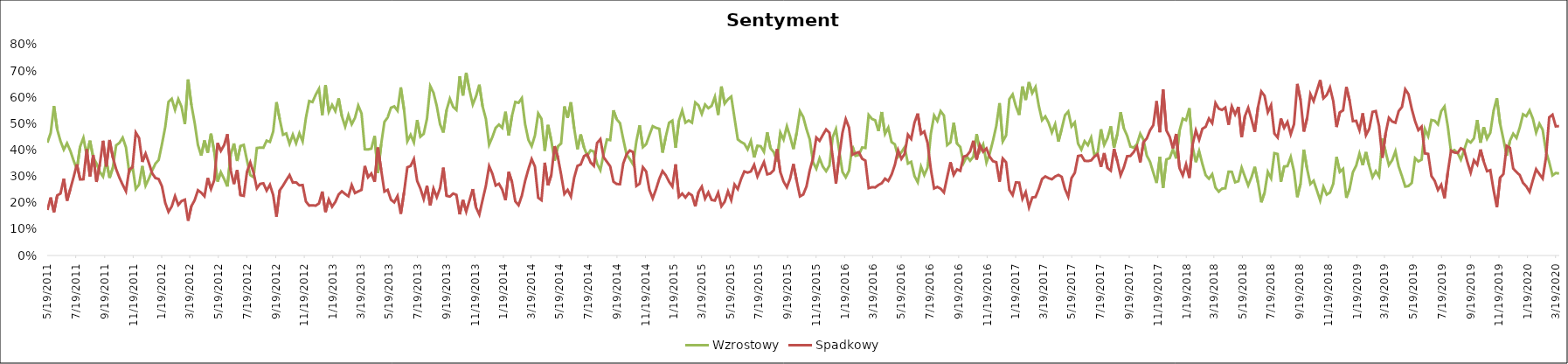
| Category | Wzrostowy | Spadkowy |
|---|---|---|
| 5/19/11 | 0.428 | 0.173 |
| 5/26/11 | 0.465 | 0.22 |
| 6/2/11 | 0.567 | 0.164 |
| 6/9/11 | 0.478 | 0.228 |
| 6/16/11 | 0.434 | 0.235 |
| 6/23/11 | 0.402 | 0.291 |
| 6/30/11 | 0.426 | 0.208 |
| 7/7/11 | 0.397 | 0.252 |
| 7/14/11 | 0.36 | 0.297 |
| 7/21/11 | 0.327 | 0.346 |
| 7/28/11 | 0.413 | 0.288 |
| 8/4/11 | 0.446 | 0.289 |
| 8/11/11 | 0.382 | 0.403 |
| 8/18/11 | 0.436 | 0.3 |
| 8/25/11 | 0.372 | 0.38 |
| 9/1/11 | 0.349 | 0.279 |
| 9/8/11 | 0.317 | 0.345 |
| 9/15/11 | 0.299 | 0.435 |
| 9/22/11 | 0.358 | 0.338 |
| 9/29/11 | 0.295 | 0.438 |
| 10/6/11 | 0.333 | 0.372 |
| 10/13/11 | 0.418 | 0.328 |
| 10/20/11 | 0.427 | 0.295 |
| 10/27/11 | 0.447 | 0.268 |
| 11/3/11 | 0.41 | 0.244 |
| 11/10/11 | 0.315 | 0.327 |
| 11/17/11 | 0.34 | 0.334 |
| 11/24/11 | 0.252 | 0.466 |
| 12/1/11 | 0.269 | 0.446 |
| 12/8/11 | 0.34 | 0.355 |
| 12/15/11 | 0.265 | 0.387 |
| 12/22/11 | 0.292 | 0.351 |
| 12/29/11 | 0.322 | 0.312 |
| 1/5/12 | 0.348 | 0.294 |
| 1/12/12 | 0.363 | 0.29 |
| 1/19/12 | 0.422 | 0.263 |
| 1/26/12 | 0.487 | 0.2 |
| 2/2/12 | 0.583 | 0.166 |
| 2/9/12 | 0.595 | 0.186 |
| 2/16/12 | 0.553 | 0.225 |
| 2/23/12 | 0.593 | 0.192 |
| 3/1/12 | 0.564 | 0.207 |
| 3/8/12 | 0.498 | 0.212 |
| 3/15/12 | 0.668 | 0.132 |
| 3/22/12 | 0.571 | 0.187 |
| 3/29/12 | 0.503 | 0.21 |
| 4/5/12 | 0.419 | 0.248 |
| 4/12/12 | 0.379 | 0.238 |
| 4/19/12 | 0.436 | 0.225 |
| 4/26/12 | 0.39 | 0.294 |
| 5/3/12 | 0.462 | 0.252 |
| 5/10/12 | 0.393 | 0.286 |
| 5/17/12 | 0.28 | 0.427 |
| 5/24/12 | 0.316 | 0.397 |
| 5/31/12 | 0.291 | 0.419 |
| 6/7/12 | 0.262 | 0.46 |
| 6/14/12 | 0.382 | 0.324 |
| 6/21/12 | 0.425 | 0.271 |
| 6/28/12 | 0.359 | 0.324 |
| 7/5/12 | 0.415 | 0.229 |
| 7/12/12 | 0.42 | 0.226 |
| 7/19/12 | 0.36 | 0.318 |
| 7/26/12 | 0.305 | 0.353 |
| 8/2/12 | 0.297 | 0.314 |
| 8/9/12 | 0.408 | 0.255 |
| 8/16/12 | 0.409 | 0.272 |
| 8/23/12 | 0.409 | 0.274 |
| 8/30/12 | 0.436 | 0.246 |
| 9/6/12 | 0.431 | 0.268 |
| 9/13/12 | 0.47 | 0.229 |
| 9/20/12 | 0.582 | 0.147 |
| 9/27/12 | 0.517 | 0.247 |
| 10/4/12 | 0.458 | 0.265 |
| 10/11/12 | 0.463 | 0.286 |
| 10/18/12 | 0.424 | 0.305 |
| 10/25/12 | 0.458 | 0.277 |
| 11/1/12 | 0.426 | 0.278 |
| 11/8/12 | 0.464 | 0.266 |
| 11/15/12 | 0.433 | 0.267 |
| 11/22/12 | 0.522 | 0.205 |
| 11/29/12 | 0.586 | 0.189 |
| 12/6/12 | 0.582 | 0.19 |
| 12/13/12 | 0.61 | 0.189 |
| 12/20/12 | 0.632 | 0.198 |
| 12/27/12 | 0.533 | 0.243 |
| 1/3/13 | 0.647 | 0.165 |
| 1/10/13 | 0.545 | 0.212 |
| 1/17/13 | 0.571 | 0.185 |
| 1/24/13 | 0.548 | 0.203 |
| 1/31/13 | 0.596 | 0.231 |
| 2/7/13 | 0.528 | 0.243 |
| 2/14/13 | 0.489 | 0.233 |
| 2/21/13 | 0.533 | 0.225 |
| 2/28/13 | 0.498 | 0.267 |
| 3/7/13 | 0.522 | 0.237 |
| 3/14/13 | 0.569 | 0.243 |
| 3/21/13 | 0.539 | 0.249 |
| 3/28/13 | 0.403 | 0.34 |
| 4/4/13 | 0.402 | 0.297 |
| 4/11/13 | 0.406 | 0.311 |
| 4/18/13 | 0.453 | 0.28 |
| 4/25/13 | 0.313 | 0.41 |
| 5/2/13 | 0.422 | 0.325 |
| 5/9/13 | 0.507 | 0.242 |
| 5/16/13 | 0.524 | 0.249 |
| 5/23/13 | 0.561 | 0.212 |
| 5/30/13 | 0.566 | 0.202 |
| 6/6/13 | 0.549 | 0.225 |
| 6/13/13 | 0.638 | 0.158 |
| 6/20/13 | 0.553 | 0.24 |
| 6/27/13 | 0.433 | 0.335 |
| 7/4/13 | 0.458 | 0.34 |
| 7/11/13 | 0.429 | 0.366 |
| 7/18/13 | 0.514 | 0.283 |
| 7/25/13 | 0.451 | 0.254 |
| 8/1/13 | 0.462 | 0.214 |
| 8/8/13 | 0.519 | 0.265 |
| 8/15/13 | 0.642 | 0.19 |
| 8/22/13 | 0.618 | 0.253 |
| 8/29/13 | 0.567 | 0.221 |
| 9/5/13 | 0.498 | 0.255 |
| 9/12/13 | 0.467 | 0.333 |
| 9/19/13 | 0.552 | 0.226 |
| 9/26/13 | 0.595 | 0.224 |
| 10/3/13 | 0.564 | 0.235 |
| 10/10/13 | 0.552 | 0.23 |
| 10/17/13 | 0.68 | 0.156 |
| 10/24/13 | 0.607 | 0.211 |
| 10/31/13 | 0.693 | 0.167 |
| 11/7/13 | 0.627 | 0.209 |
| 11/14/13 | 0.573 | 0.252 |
| 11/21/13 | 0.604 | 0.182 |
| 11/28/13 | 0.648 | 0.155 |
| 12/5/13 | 0.566 | 0.211 |
| 12/12/13 | 0.519 | 0.264 |
| 12/19/13 | 0.42 | 0.339 |
| 12/26/13 | 0.45 | 0.31 |
| 1/2/14 | 0.484 | 0.266 |
| 1/9/14 | 0.497 | 0.272 |
| 1/16/14 | 0.484 | 0.25 |
| 1/23/14 | 0.545 | 0.21 |
| 1/30/14 | 0.455 | 0.317 |
| 2/6/14 | 0.531 | 0.278 |
| 2/13/14 | 0.582 | 0.205 |
| 2/20/14 | 0.579 | 0.191 |
| 2/27/14 | 0.597 | 0.227 |
| 3/6/14 | 0.498 | 0.283 |
| 3/13/14 | 0.439 | 0.327 |
| 3/20/14 | 0.415 | 0.366 |
| 3/27/14 | 0.455 | 0.337 |
| 4/3/14 | 0.539 | 0.219 |
| 4/10/14 | 0.519 | 0.21 |
| 4/17/14 | 0.397 | 0.352 |
| 4/24/14 | 0.495 | 0.266 |
| 5/1/14 | 0.437 | 0.306 |
| 5/8/14 | 0.359 | 0.415 |
| 5/15/14 | 0.414 | 0.374 |
| 5/22/14 | 0.425 | 0.307 |
| 5/29/14 | 0.566 | 0.234 |
| 6/5/14 | 0.522 | 0.249 |
| 6/12/14 | 0.581 | 0.224 |
| 6/19/14 | 0.482 | 0.295 |
| 6/26/14 | 0.403 | 0.34 |
| 7/3/14 | 0.459 | 0.345 |
| 7/10/14 | 0.41 | 0.377 |
| 7/17/14 | 0.379 | 0.383 |
| 7/24/14 | 0.399 | 0.353 |
| 7/31/14 | 0.394 | 0.34 |
| 8/7/14 | 0.348 | 0.427 |
| 8/14/14 | 0.324 | 0.441 |
| 8/21/14 | 0.386 | 0.373 |
| 8/28/14 | 0.44 | 0.356 |
| 9/4/14 | 0.438 | 0.338 |
| 9/11/14 | 0.551 | 0.28 |
| 9/18/14 | 0.516 | 0.271 |
| 9/25/14 | 0.502 | 0.271 |
| 10/2/14 | 0.441 | 0.349 |
| 10/9/14 | 0.383 | 0.383 |
| 10/16/14 | 0.366 | 0.398 |
| 10/23/14 | 0.345 | 0.392 |
| 10/30/14 | 0.433 | 0.264 |
| 11/6/14 | 0.494 | 0.272 |
| 11/13/14 | 0.411 | 0.335 |
| 11/20/14 | 0.422 | 0.319 |
| 11/27/14 | 0.457 | 0.248 |
| 12/4/14 | 0.49 | 0.217 |
| 12/11/14 | 0.484 | 0.251 |
| 12/18/14 | 0.481 | 0.29 |
| 12/25/14 | 0.39 | 0.32 |
| 1/1/15 | 0.451 | 0.304 |
| 1/8/15 | 0.503 | 0.28 |
| 1/15/15 | 0.512 | 0.262 |
| 1/22/15 | 0.409 | 0.346 |
| 1/29/15 | 0.511 | 0.222 |
| 2/5/15 | 0.55 | 0.235 |
| 2/12/15 | 0.504 | 0.22 |
| 2/19/15 | 0.512 | 0.236 |
| 2/26/15 | 0.504 | 0.228 |
| 3/5/15 | 0.581 | 0.186 |
| 3/12/15 | 0.57 | 0.241 |
| 3/19/15 | 0.537 | 0.261 |
| 3/26/15 | 0.573 | 0.216 |
| 4/2/15 | 0.559 | 0.239 |
| 4/9/15 | 0.568 | 0.211 |
| 4/16/15 | 0.602 | 0.208 |
| 4/23/15 | 0.533 | 0.238 |
| 4/30/15 | 0.641 | 0.187 |
| 5/7/15 | 0.577 | 0.204 |
| 5/14/15 | 0.593 | 0.243 |
| 5/21/15 | 0.603 | 0.21 |
| 5/28/15 | 0.521 | 0.269 |
| 6/4/15 | 0.44 | 0.252 |
| 6/11/15 | 0.431 | 0.29 |
| 6/18/15 | 0.424 | 0.319 |
| 6/25/15 | 0.403 | 0.314 |
| 7/2/15 | 0.435 | 0.319 |
| 7/9/15 | 0.372 | 0.344 |
| 7/16/15 | 0.416 | 0.3 |
| 7/23/15 | 0.415 | 0.327 |
| 7/30/15 | 0.393 | 0.354 |
| 8/6/15 | 0.467 | 0.308 |
| 8/13/15 | 0.407 | 0.311 |
| 8/20/15 | 0.392 | 0.324 |
| 8/27/15 | 0.357 | 0.403 |
| 9/3/15 | 0.466 | 0.316 |
| 9/10/15 | 0.44 | 0.28 |
| 9/17/15 | 0.49 | 0.259 |
| 9/24/15 | 0.451 | 0.292 |
| 10/1/15 | 0.404 | 0.347 |
| 10/8/15 | 0.466 | 0.283 |
| 10/15/15 | 0.547 | 0.224 |
| 10/22/15 | 0.525 | 0.231 |
| 10/29/15 | 0.479 | 0.262 |
| 11/5/15 | 0.44 | 0.324 |
| 11/12/15 | 0.354 | 0.369 |
| 11/19/15 | 0.329 | 0.447 |
| 11/26/15 | 0.369 | 0.435 |
| 12/3/15 | 0.337 | 0.457 |
| 12/10/15 | 0.32 | 0.478 |
| 12/17/15 | 0.341 | 0.466 |
| 12/24/15 | 0.449 | 0.374 |
| 12/31/15 | 0.479 | 0.273 |
| 1/7/16 | 0.398 | 0.378 |
| 1/14/16 | 0.317 | 0.466 |
| 1/21/16 | 0.297 | 0.517 |
| 1/28/16 | 0.322 | 0.485 |
| 2/4/16 | 0.415 | 0.382 |
| 2/11/16 | 0.378 | 0.388 |
| 2/18/16 | 0.381 | 0.392 |
| 2/25/16 | 0.41 | 0.367 |
| 3/3/16 | 0.408 | 0.36 |
| 3/10/16 | 0.533 | 0.256 |
| 3/17/16 | 0.518 | 0.259 |
| 3/24/16 | 0.513 | 0.258 |
| 3/31/16 | 0.472 | 0.268 |
| 4/7/16 | 0.544 | 0.274 |
| 4/14/16 | 0.461 | 0.292 |
| 4/21/16 | 0.485 | 0.283 |
| 4/28/16 | 0.43 | 0.307 |
| 5/5/16 | 0.422 | 0.343 |
| 5/12/16 | 0.375 | 0.399 |
| 5/19/16 | 0.392 | 0.367 |
| 5/26/16 | 0.411 | 0.386 |
| 6/2/16 | 0.349 | 0.458 |
| 6/9/16 | 0.355 | 0.442 |
| 6/16/16 | 0.302 | 0.504 |
| 6/23/16 | 0.278 | 0.538 |
| 6/30/16 | 0.337 | 0.461 |
| 7/7/16 | 0.305 | 0.471 |
| 7/14/16 | 0.333 | 0.428 |
| 7/21/16 | 0.462 | 0.327 |
| 7/28/16 | 0.531 | 0.254 |
| 8/4/16 | 0.51 | 0.26 |
| 8/11/16 | 0.548 | 0.253 |
| 8/18/16 | 0.531 | 0.239 |
| 8/25/16 | 0.419 | 0.297 |
| 9/1/16 | 0.429 | 0.354 |
| 9/8/16 | 0.504 | 0.306 |
| 9/15/16 | 0.424 | 0.327 |
| 9/22/16 | 0.412 | 0.321 |
| 9/29/16 | 0.351 | 0.375 |
| 10/6/16 | 0.375 | 0.379 |
| 10/13/16 | 0.36 | 0.395 |
| 10/20/16 | 0.375 | 0.435 |
| 10/27/16 | 0.461 | 0.364 |
| 11/3/16 | 0.396 | 0.419 |
| 11/10/16 | 0.421 | 0.394 |
| 11/17/16 | 0.353 | 0.406 |
| 11/24/16 | 0.387 | 0.374 |
| 12/1/16 | 0.436 | 0.358 |
| 12/8/16 | 0.491 | 0.354 |
| 12/15/16 | 0.578 | 0.28 |
| 12/22/16 | 0.433 | 0.368 |
| 12/29/16 | 0.455 | 0.354 |
| 1/5/17 | 0.593 | 0.249 |
| 1/12/17 | 0.611 | 0.229 |
| 1/19/17 | 0.566 | 0.277 |
| 1/26/17 | 0.533 | 0.277 |
| 2/2/17 | 0.641 | 0.215 |
| 2/9/17 | 0.59 | 0.24 |
| 2/16/17 | 0.658 | 0.183 |
| 2/23/17 | 0.616 | 0.22 |
| 3/2/17 | 0.639 | 0.222 |
| 3/9/17 | 0.568 | 0.253 |
| 3/16/17 | 0.513 | 0.29 |
| 3/23/17 | 0.528 | 0.3 |
| 3/30/17 | 0.503 | 0.293 |
| 4/6/17 | 0.467 | 0.289 |
| 4/13/17 | 0.498 | 0.3 |
| 4/20/17 | 0.432 | 0.306 |
| 4/27/17 | 0.481 | 0.298 |
| 5/4/17 | 0.532 | 0.252 |
| 5/11/17 | 0.546 | 0.223 |
| 5/18/17 | 0.49 | 0.294 |
| 5/25/17 | 0.505 | 0.314 |
| 6/1/17 | 0.425 | 0.377 |
| 6/8/17 | 0.402 | 0.38 |
| 6/15/17 | 0.434 | 0.359 |
| 6/22/17 | 0.419 | 0.358 |
| 6/29/17 | 0.447 | 0.361 |
| 7/6/17 | 0.379 | 0.375 |
| 7/13/17 | 0.391 | 0.384 |
| 7/20/17 | 0.479 | 0.336 |
| 7/27/17 | 0.42 | 0.389 |
| 8/3/17 | 0.445 | 0.332 |
| 8/10/17 | 0.49 | 0.322 |
| 8/17/17 | 0.409 | 0.405 |
| 8/24/17 | 0.46 | 0.358 |
| 8/31/17 | 0.544 | 0.304 |
| 9/7/17 | 0.482 | 0.335 |
| 9/14/17 | 0.455 | 0.377 |
| 9/21/17 | 0.413 | 0.378 |
| 9/28/17 | 0.409 | 0.392 |
| 10/5/17 | 0.422 | 0.414 |
| 10/12/17 | 0.462 | 0.353 |
| 10/19/17 | 0.439 | 0.43 |
| 10/26/17 | 0.379 | 0.444 |
| 11/2/17 | 0.355 | 0.475 |
| 11/9/17 | 0.315 | 0.494 |
| 11/16/17 | 0.275 | 0.586 |
| 11/23/17 | 0.375 | 0.467 |
| 11/30/17 | 0.257 | 0.63 |
| 12/7/17 | 0.364 | 0.475 |
| 12/14/17 | 0.369 | 0.451 |
| 12/21/17 | 0.403 | 0.407 |
| 12/28/17 | 0.368 | 0.461 |
| 1/4/18 | 0.473 | 0.332 |
| 1/11/18 | 0.519 | 0.304 |
| 1/18/18 | 0.513 | 0.346 |
| 1/25/18 | 0.559 | 0.294 |
| 2/1/18 | 0.412 | 0.421 |
| 2/8/18 | 0.354 | 0.474 |
| 2/15/18 | 0.396 | 0.439 |
| 2/22/18 | 0.347 | 0.481 |
| 3/1/18 | 0.305 | 0.488 |
| 3/8/18 | 0.291 | 0.52 |
| 3/15/18 | 0.308 | 0.502 |
| 3/22/18 | 0.257 | 0.578 |
| 3/29/18 | 0.242 | 0.557 |
| 4/5/18 | 0.254 | 0.552 |
| 4/12/18 | 0.255 | 0.561 |
| 4/19/18 | 0.318 | 0.496 |
| 4/26/18 | 0.317 | 0.565 |
| 5/3/18 | 0.278 | 0.535 |
| 5/10/18 | 0.282 | 0.564 |
| 5/17/18 | 0.333 | 0.449 |
| 5/24/18 | 0.299 | 0.529 |
| 5/31/18 | 0.266 | 0.56 |
| 6/7/18 | 0.297 | 0.517 |
| 6/14/18 | 0.336 | 0.469 |
| 6/21/18 | 0.277 | 0.562 |
| 6/28/18 | 0.202 | 0.622 |
| 7/5/18 | 0.238 | 0.606 |
| 7/12/18 | 0.317 | 0.543 |
| 7/19/18 | 0.293 | 0.57 |
| 7/26/18 | 0.388 | 0.463 |
| 8/2/18 | 0.385 | 0.448 |
| 8/9/18 | 0.279 | 0.52 |
| 8/16/18 | 0.338 | 0.484 |
| 8/23/18 | 0.339 | 0.507 |
| 8/30/18 | 0.374 | 0.46 |
| 9/6/18 | 0.32 | 0.498 |
| 9/13/18 | 0.221 | 0.651 |
| 9/20/18 | 0.273 | 0.59 |
| 9/27/18 | 0.402 | 0.47 |
| 10/4/18 | 0.329 | 0.521 |
| 10/11/18 | 0.271 | 0.612 |
| 10/18/18 | 0.284 | 0.585 |
| 10/25/18 | 0.247 | 0.626 |
| 11/1/18 | 0.209 | 0.665 |
| 11/8/18 | 0.26 | 0.596 |
| 11/15/18 | 0.231 | 0.609 |
| 11/22/18 | 0.239 | 0.637 |
| 11/29/18 | 0.272 | 0.585 |
| 12/6/18 | 0.374 | 0.487 |
| 12/13/18 | 0.317 | 0.543 |
| 12/20/18 | 0.328 | 0.551 |
| 12/27/18 | 0.219 | 0.639 |
| 1/3/19 | 0.253 | 0.588 |
| 1/10/19 | 0.316 | 0.51 |
| 1/17/19 | 0.341 | 0.511 |
| 1/24/19 | 0.387 | 0.476 |
| 1/31/19 | 0.343 | 0.539 |
| 2/7/19 | 0.392 | 0.457 |
| 2/14/19 | 0.339 | 0.481 |
| 2/21/19 | 0.297 | 0.545 |
| 2/28/19 | 0.32 | 0.548 |
| 3/7/19 | 0.3 | 0.491 |
| 3/14/19 | 0.444 | 0.371 |
| 3/21/19 | 0.394 | 0.463 |
| 3/28/19 | 0.343 | 0.522 |
| 4/4/19 | 0.361 | 0.508 |
| 4/11/19 | 0.396 | 0.504 |
| 4/18/19 | 0.337 | 0.548 |
| 4/25/19 | 0.301 | 0.564 |
| 5/2/19 | 0.261 | 0.631 |
| 5/9/19 | 0.264 | 0.612 |
| 5/16/19 | 0.276 | 0.556 |
| 5/23/19 | 0.369 | 0.51 |
| 5/30/19 | 0.357 | 0.476 |
| 6/6/19 | 0.364 | 0.489 |
| 6/13/19 | 0.48 | 0.387 |
| 6/20/19 | 0.453 | 0.385 |
| 6/27/19 | 0.514 | 0.302 |
| 7/4/19 | 0.511 | 0.283 |
| 7/11/19 | 0.497 | 0.249 |
| 7/18/19 | 0.547 | 0.268 |
| 7/25/19 | 0.565 | 0.217 |
| 8/1/19 | 0.49 | 0.315 |
| 8/8/19 | 0.393 | 0.398 |
| 8/15/19 | 0.4 | 0.391 |
| 8/22/19 | 0.389 | 0.389 |
| 8/29/19 | 0.364 | 0.407 |
| 9/5/19 | 0.4 | 0.4 |
| 9/12/19 | 0.438 | 0.354 |
| 9/19/19 | 0.429 | 0.314 |
| 9/26/19 | 0.444 | 0.361 |
| 10/3/19 | 0.514 | 0.345 |
| 10/10/19 | 0.428 | 0.402 |
| 10/17/19 | 0.487 | 0.356 |
| 10/24/19 | 0.443 | 0.32 |
| 10/31/19 | 0.466 | 0.324 |
| 11/7/19 | 0.549 | 0.249 |
| 11/14/19 | 0.597 | 0.183 |
| 11/21/19 | 0.5 | 0.295 |
| 11/28/19 | 0.441 | 0.309 |
| 12/5/19 | 0.379 | 0.416 |
| 12/12/19 | 0.435 | 0.408 |
| 12/19/19 | 0.462 | 0.33 |
| 12/26/19 | 0.446 | 0.317 |
| 1/2/20 | 0.486 | 0.305 |
| 1/9/20 | 0.536 | 0.276 |
| 1/16/20 | 0.528 | 0.262 |
| 1/23/20 | 0.551 | 0.242 |
| 1/30/20 | 0.519 | 0.286 |
| 2/6/20 | 0.466 | 0.327 |
| 2/13/20 | 0.5 | 0.309 |
| 2/20/20 | 0.477 | 0.292 |
| 2/27/20 | 0.396 | 0.37 |
| 3/5/20 | 0.354 | 0.524 |
| 3/12/20 | 0.304 | 0.534 |
| 3/19/20 | 0.313 | 0.49 |
| 3/26/20 | 0.311 | 0.491 |